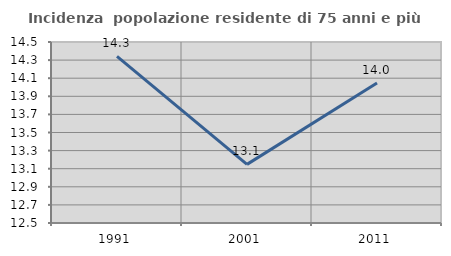
| Category | Incidenza  popolazione residente di 75 anni e più |
|---|---|
| 1991.0 | 14.34 |
| 2001.0 | 13.148 |
| 2011.0 | 14.046 |